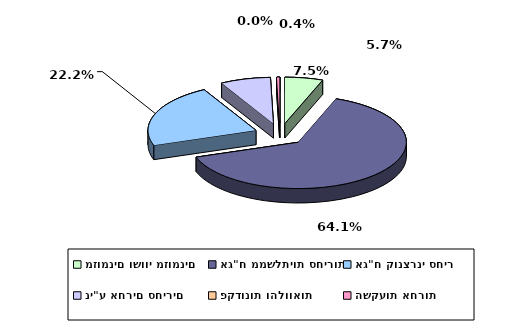
| Category | Series 0 |
|---|---|
| מזומנים ושווי מזומנים | 0.057 |
| אג"ח ממשלתיות סחירות | 0.641 |
| אג"ח קונצרני סחיר | 0.222 |
| ני"ע אחרים סחירים | 0.075 |
| פקדונות והלוואות | 0 |
| השקעות אחרות | 0.004 |